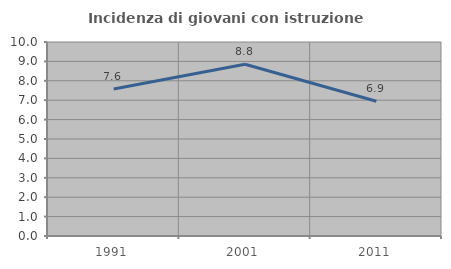
| Category | Incidenza di giovani con istruzione universitaria |
|---|---|
| 1991.0 | 7.576 |
| 2001.0 | 8.85 |
| 2011.0 | 6.944 |